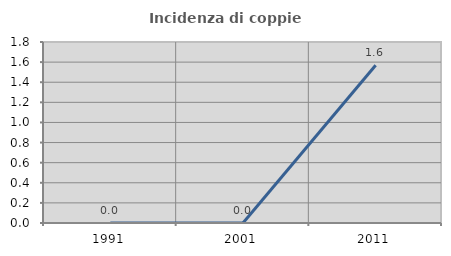
| Category | Incidenza di coppie miste |
|---|---|
| 1991.0 | 0 |
| 2001.0 | 0 |
| 2011.0 | 1.568 |